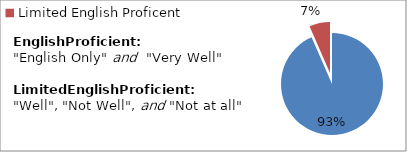
| Category | Percent |
|---|---|
| English Proficient | 0.934 |
| Limited English Proficent | 0.066 |